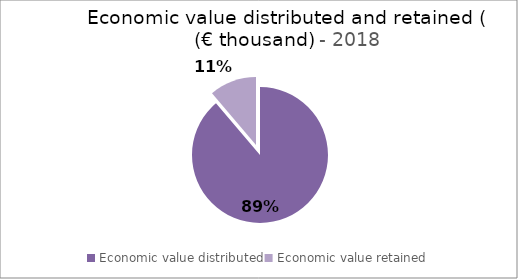
| Category | Series 1 |
|---|---|
| Economic value distributed | 2440370 |
| Economic value retained | 307840 |